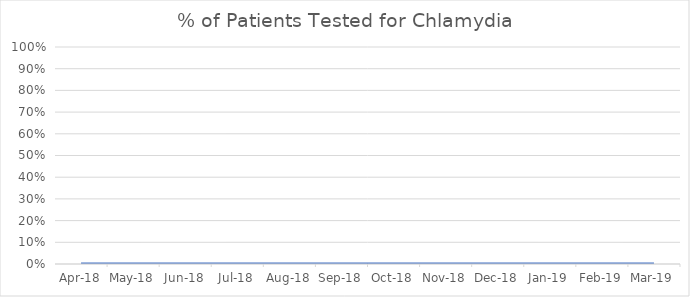
| Category | Percentage Tested Current Month |
|---|---|
| 2018-04-01 | 0 |
| 2018-05-01 | 0 |
| 2018-06-01 | 0 |
| 2018-07-01 | 0 |
| 2018-08-01 | 0 |
| 2018-09-01 | 0 |
| 2018-10-01 | 0 |
| 2018-11-01 | 0 |
| 2018-12-01 | 0 |
| 2019-01-01 | 0 |
| 2019-02-01 | 0 |
| 2019-03-01 | 0 |